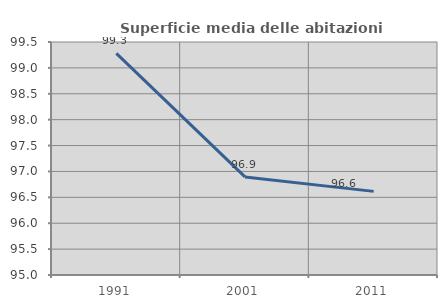
| Category | Superficie media delle abitazioni occupate |
|---|---|
| 1991.0 | 99.282 |
| 2001.0 | 96.895 |
| 2011.0 | 96.615 |